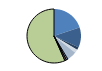
| Category | Series 0 |
|---|---|
| ARRASTRE | 249 |
| CERCO | 151 |
| ATUNEROS CAÑEROS | 21 |
| PALANGRE DE FONDO | 26 |
| PALANGRE DE SUPERFICIE | 63 |
| RASCO | 10 |
| VOLANTA | 12 |
| ARTES FIJAS | 12 |
| ARTES MENORES | 710 |